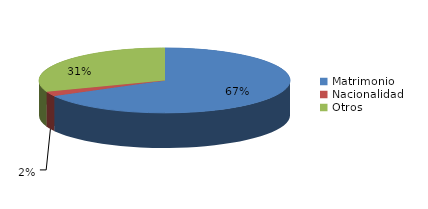
| Category | Series 0 |
|---|---|
| Matrimonio | 3669 |
| Nacionalidad | 130 |
| Otros | 1679 |